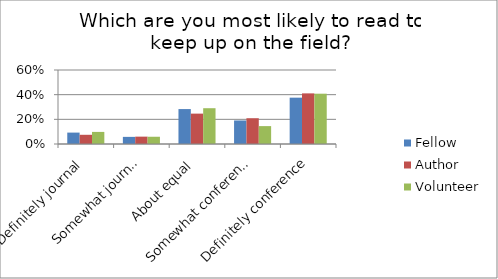
| Category | Fellow | Author | Volunteer |
|---|---|---|---|
| Definitely journal | 0.092 | 0.075 | 0.098 |
| Somewhat journal | 0.058 | 0.06 | 0.059 |
| About equal | 0.283 | 0.246 | 0.29 |
| Somewhat conference | 0.191 | 0.209 | 0.145 |
| Definitely conference | 0.376 | 0.41 | 0.408 |